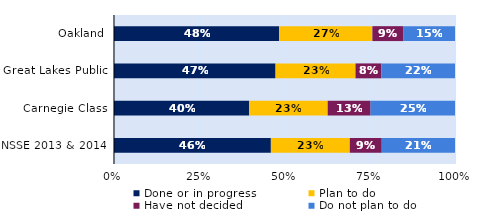
| Category | Done or in progress | Plan to do | Have not decided | Do not plan to do |
|---|---|---|---|---|
| Oakland | 0.484 | 0.273 | 0.091 | 0.151 |
| Great Lakes Public | 0.474 | 0.234 | 0.076 | 0.216 |
| Carnegie Class | 0.396 | 0.23 | 0.126 | 0.248 |
| NSSE 2013 & 2014 | 0.46 | 0.232 | 0.094 | 0.215 |